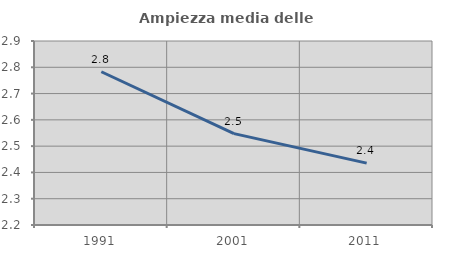
| Category | Ampiezza media delle famiglie |
|---|---|
| 1991.0 | 2.783 |
| 2001.0 | 2.548 |
| 2011.0 | 2.435 |